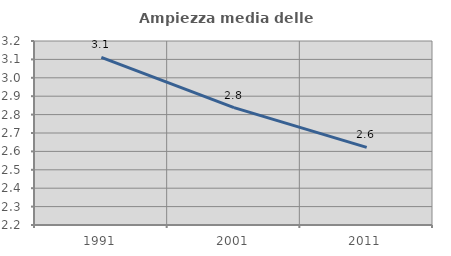
| Category | Ampiezza media delle famiglie |
|---|---|
| 1991.0 | 3.111 |
| 2001.0 | 2.838 |
| 2011.0 | 2.622 |